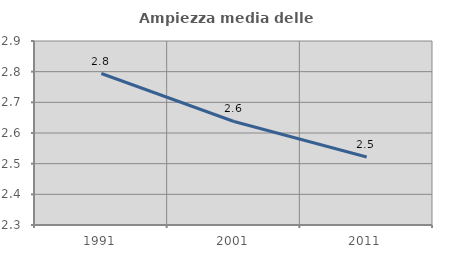
| Category | Ampiezza media delle famiglie |
|---|---|
| 1991.0 | 2.794 |
| 2001.0 | 2.638 |
| 2011.0 | 2.522 |